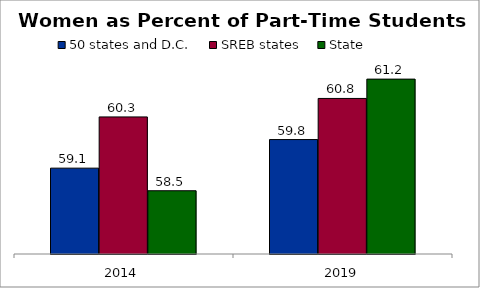
| Category | 50 states and D.C. | SREB states | State |
|---|---|---|---|
| 2014.0 | 59.077 | 60.316 | 58.53 |
| 2019.0 | 59.769 | 60.764 | 61.231 |